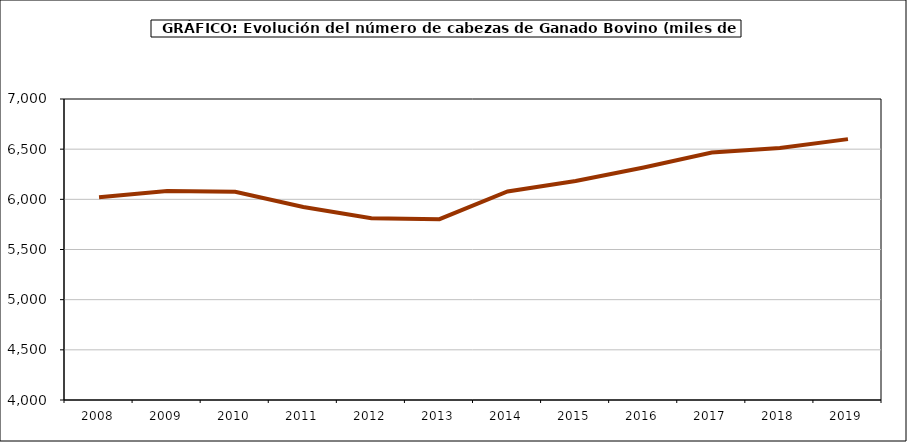
| Category | Series 0 |
|---|---|
| 2008.0 | 6020 |
| 2009.0 | 6082.442 |
| 2010.0 | 6075 |
| 2011.0 | 5923 |
| 2012.0 | 5812.605 |
| 2013.0 | 5802.22 |
| 2014.0 | 6078.733 |
| 2015.0 | 6182.908 |
| 2016.0 | 6317.641 |
| 2017.0 | 6465.747 |
| 2018.0 | 6510.592 |
| 2019.0 | 6600 |